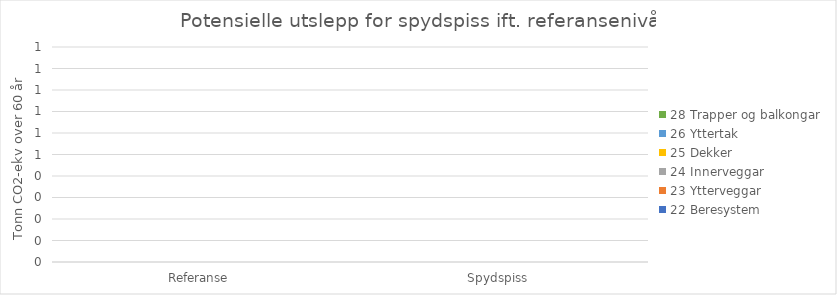
| Category | 22 Beresystem | 23 Ytterveggar | 24 Innerveggar | 25 Dekker | 26 Yttertak | 28 Trapper og balkongar |
|---|---|---|---|---|---|---|
| Referanse | 0 | 0 | 0 | 0 | 0 | 0 |
| Spydspiss | 0 | 0 | 0 | 0 | 0 | 0 |